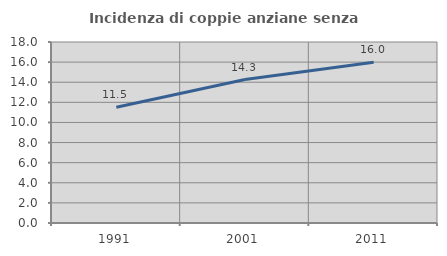
| Category | Incidenza di coppie anziane senza figli  |
|---|---|
| 1991.0 | 11.508 |
| 2001.0 | 14.263 |
| 2011.0 | 15.995 |